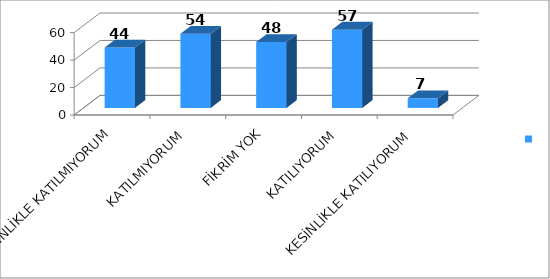
| Category | Series 0 |
|---|---|
| KESİNLİKLE KATILMIYORUM | 44 |
| KATILMIYORUM | 54 |
| FİKRİM YOK | 48 |
| KATILIYORUM | 57 |
| KESİNLİKLE KATILIYORUM | 7 |